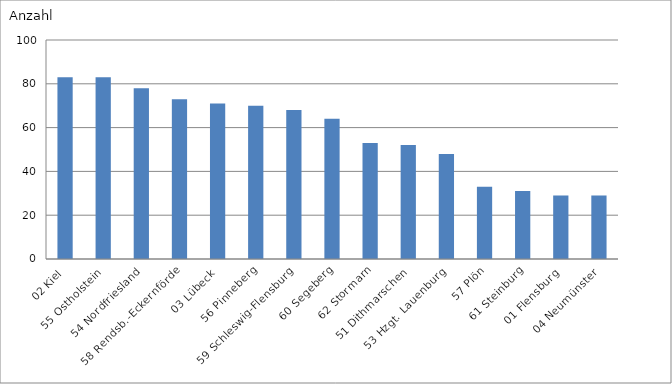
| Category | 02 Kiel |
|---|---|
| 02 Kiel | 83 |
| 55 Ostholstein | 83 |
| 54 Nordfriesland | 78 |
| 58 Rendsb.-Eckernförde | 73 |
| 03 Lübeck | 71 |
| 56 Pinneberg | 70 |
| 59 Schleswig-Flensburg | 68 |
| 60 Segeberg | 64 |
| 62 Stormarn | 53 |
| 51 Dithmarschen | 52 |
| 53 Hzgt. Lauenburg | 48 |
| 57 Plön | 33 |
| 61 Steinburg | 31 |
| 01 Flensburg | 29 |
| 04 Neumünster | 29 |